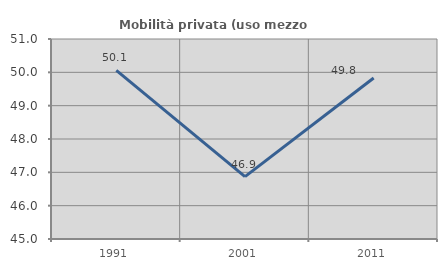
| Category | Mobilità privata (uso mezzo privato) |
|---|---|
| 1991.0 | 50.06 |
| 2001.0 | 46.87 |
| 2011.0 | 49.832 |